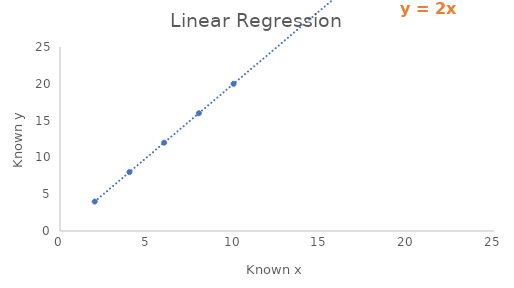
| Category | Example |
|---|---|
| 2.0 | 4 |
| 4.0 | 8 |
| 6.0 | 12 |
| 8.0 | 16 |
| 10.0 | 20 |